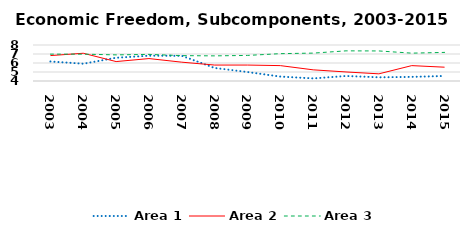
| Category | Area 1 | Area 2 | Area 3 |
|---|---|---|---|
| 2003.0 | 6.17 | 6.823 | 6.984 |
| 2004.0 | 5.92 | 7.082 | 6.983 |
| 2005.0 | 6.583 | 6.159 | 6.902 |
| 2006.0 | 6.81 | 6.493 | 6.956 |
| 2007.0 | 6.797 | 6.092 | 6.819 |
| 2008.0 | 5.45 | 5.771 | 6.792 |
| 2009.0 | 4.997 | 5.772 | 6.842 |
| 2010.0 | 4.493 | 5.709 | 7.038 |
| 2011.0 | 4.287 | 5.24 | 7.099 |
| 2012.0 | 4.558 | 5.004 | 7.349 |
| 2013.0 | 4.41 | 4.796 | 7.339 |
| 2014.0 | 4.456 | 5.709 | 7.094 |
| 2015.0 | 4.56 | 5.534 | 7.179 |